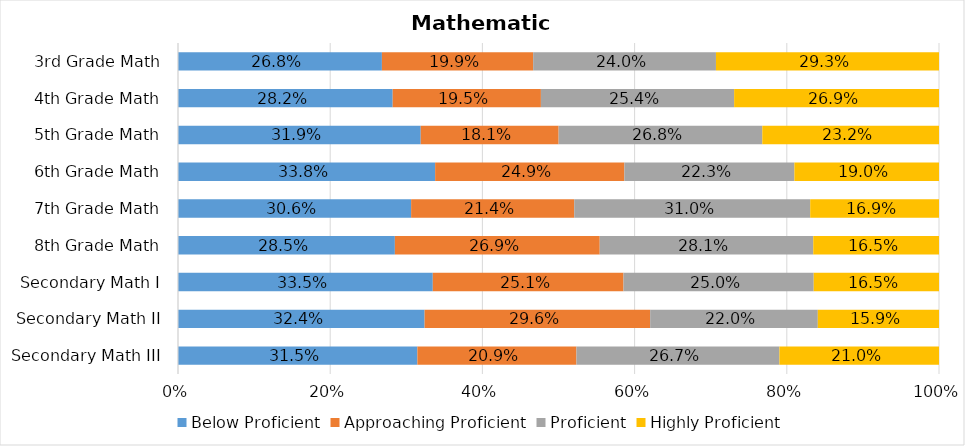
| Category | Below Proficient | Approaching Proficient | Proficient | Highly Proficient |
|---|---|---|---|---|
| Secondary Math III | 0.315 | 0.209 | 0.267 | 0.21 |
| Secondary Math II | 0.324 | 0.296 | 0.22 | 0.159 |
| Secondary Math I | 0.335 | 0.251 | 0.25 | 0.165 |
| 8th Grade Math | 0.285 | 0.269 | 0.281 | 0.165 |
| 7th Grade Math | 0.306 | 0.214 | 0.31 | 0.169 |
| 6th Grade Math | 0.338 | 0.249 | 0.223 | 0.19 |
| 5th Grade Math | 0.319 | 0.181 | 0.268 | 0.232 |
| 4th Grade Math | 0.282 | 0.195 | 0.254 | 0.269 |
| 3rd Grade Math | 0.268 | 0.199 | 0.24 | 0.293 |